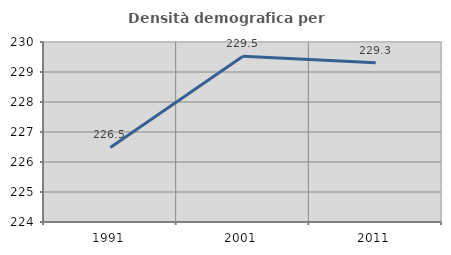
| Category | Densità demografica |
|---|---|
| 1991.0 | 226.483 |
| 2001.0 | 229.522 |
| 2011.0 | 229.305 |